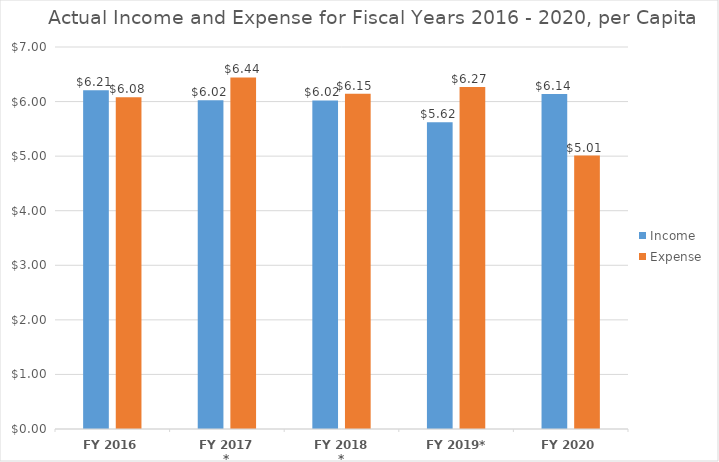
| Category | Income | Expense |
|---|---|---|
| FY 2016 | 6.209 | 6.08 |
| FY 2017 * | 6.023 | 6.441 |
| FY 2018 * | 6.021 | 6.146 |
| FY 2019* | 5.623 | 6.265 |
| FY 2020 | 6.137 | 5.011 |